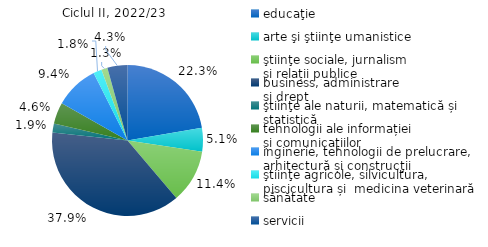
| Category | 2022/23 |
|---|---|
| educaţie | 22.3 |
| arte şi ştiinţe umanistice | 5.1 |
| ştiinţe sociale, jurnalism
și relații publice   | 11.4 |
| business, administrare 
și drept | 37.9 |
| ştiinţe ale naturii, matematică și statistică | 1.9 |
| tehnologii ale informației 
și comunicațiilor  | 4.6 |
| inginerie, tehnologii de prelucrare, 
arhitectură și construcţii | 9.4 |
| ştiinţe agricole, silvicultura, 
piscicultura și  medicina veterinară | 1.8 |
| sănătate | 1.3 |
| servicii | 4.3 |